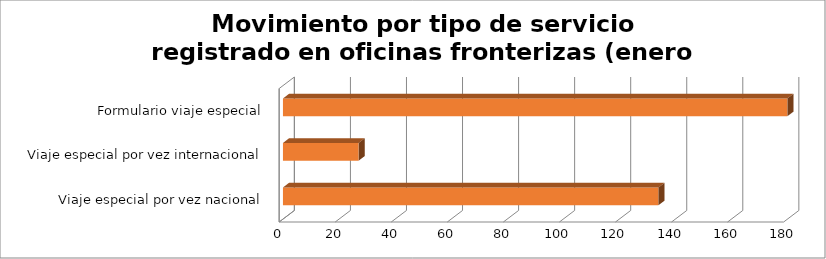
| Category | Series 0 |
|---|---|
| Viaje especial por vez nacional | 134 |
| Viaje especial por vez internacional | 27 |
| Formulario viaje especial | 180 |